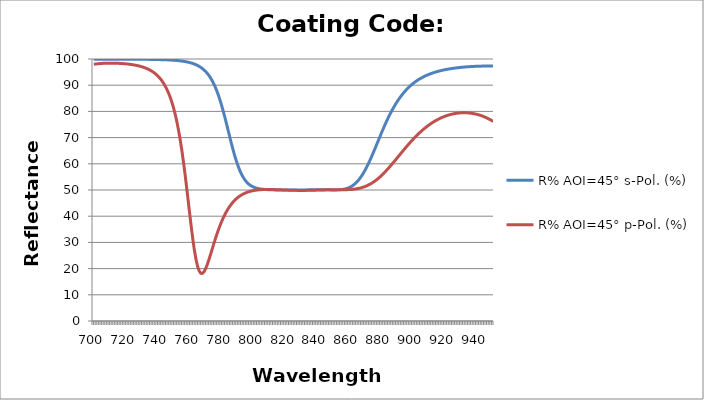
| Category | R% AOI=45° s-Pol. (%) | R% AOI=45° p-Pol. (%) |
|---|---|---|
| 700.0 | 99.902 | 97.995 |
| 701.0 | 99.907 | 98.077 |
| 702.0 | 99.912 | 98.148 |
| 703.0 | 99.915 | 98.208 |
| 704.0 | 99.918 | 98.259 |
| 705.0 | 99.921 | 98.301 |
| 706.0 | 99.923 | 98.335 |
| 707.0 | 99.925 | 98.362 |
| 708.0 | 99.926 | 98.382 |
| 709.0 | 99.927 | 98.395 |
| 710.0 | 99.928 | 98.403 |
| 711.0 | 99.929 | 98.404 |
| 712.0 | 99.929 | 98.4 |
| 713.0 | 99.929 | 98.39 |
| 714.0 | 99.929 | 98.374 |
| 715.0 | 99.928 | 98.353 |
| 716.0 | 99.927 | 98.325 |
| 717.0 | 99.926 | 98.292 |
| 718.0 | 99.925 | 98.252 |
| 719.0 | 99.924 | 98.205 |
| 720.0 | 99.922 | 98.151 |
| 721.0 | 99.92 | 98.09 |
| 722.0 | 99.918 | 98.02 |
| 723.0 | 99.915 | 97.942 |
| 724.0 | 99.913 | 97.853 |
| 725.0 | 99.909 | 97.754 |
| 726.0 | 99.906 | 97.643 |
| 727.0 | 99.902 | 97.519 |
| 728.0 | 99.898 | 97.38 |
| 729.0 | 99.893 | 97.226 |
| 730.0 | 99.887 | 97.052 |
| 731.0 | 99.882 | 96.859 |
| 732.0 | 99.875 | 96.642 |
| 733.0 | 99.868 | 96.399 |
| 734.0 | 99.86 | 96.126 |
| 735.0 | 99.851 | 95.819 |
| 736.0 | 99.842 | 95.473 |
| 737.0 | 99.831 | 95.084 |
| 738.0 | 99.819 | 94.643 |
| 739.0 | 99.806 | 94.143 |
| 740.0 | 99.791 | 93.577 |
| 741.0 | 99.775 | 92.932 |
| 742.0 | 99.757 | 92.197 |
| 743.0 | 99.737 | 91.357 |
| 744.0 | 99.715 | 90.396 |
| 745.0 | 99.69 | 89.293 |
| 746.0 | 99.663 | 88.076 |
| 747.0 | 99.633 | 86.683 |
| 748.0 | 99.6 | 85.088 |
| 749.0 | 99.562 | 83.26 |
| 750.0 | 99.52 | 81.168 |
| 751.0 | 99.473 | 78.776 |
| 752.0 | 99.42 | 76.05 |
| 753.0 | 99.36 | 72.956 |
| 754.0 | 99.292 | 69.467 |
| 755.0 | 99.215 | 65.567 |
| 756.0 | 99.128 | 61.257 |
| 757.0 | 99.029 | 56.568 |
| 758.0 | 98.916 | 51.562 |
| 759.0 | 98.787 | 46.348 |
| 760.0 | 98.64 | 41.076 |
| 761.0 | 98.472 | 35.938 |
| 762.0 | 98.28 | 31.146 |
| 763.0 | 98.059 | 26.912 |
| 764.0 | 97.805 | 23.416 |
| 765.0 | 97.513 | 20.778 |
| 766.0 | 97.176 | 19.05 |
| 767.0 | 96.788 | 18.206 |
| 768.0 | 96.341 | 18.162 |
| 769.0 | 95.826 | 18.792 |
| 770.0 | 95.231 | 19.951 |
| 771.0 | 94.547 | 21.496 |
| 772.0 | 93.76 | 23.297 |
| 773.0 | 92.858 | 25.244 |
| 774.0 | 91.826 | 27.249 |
| 775.0 | 90.651 | 29.248 |
| 776.0 | 89.321 | 31.191 |
| 777.0 | 87.824 | 33.046 |
| 778.0 | 86.156 | 34.795 |
| 779.0 | 84.312 | 36.424 |
| 780.0 | 82.3 | 37.93 |
| 781.0 | 80.132 | 39.311 |
| 782.0 | 77.833 | 40.572 |
| 783.0 | 75.434 | 41.717 |
| 784.0 | 72.976 | 42.752 |
| 785.0 | 70.509 | 43.685 |
| 786.0 | 68.082 | 44.523 |
| 787.0 | 65.745 | 45.272 |
| 788.0 | 63.541 | 45.941 |
| 789.0 | 61.507 | 46.536 |
| 790.0 | 59.667 | 47.064 |
| 791.0 | 58.034 | 47.53 |
| 792.0 | 56.612 | 47.941 |
| 793.0 | 55.392 | 48.302 |
| 794.0 | 54.363 | 48.617 |
| 795.0 | 53.506 | 48.891 |
| 796.0 | 52.802 | 49.129 |
| 797.0 | 52.228 | 49.334 |
| 798.0 | 51.765 | 49.509 |
| 799.0 | 51.395 | 49.658 |
| 800.0 | 51.1 | 49.783 |
| 801.0 | 50.867 | 49.888 |
| 802.0 | 50.683 | 49.973 |
| 803.0 | 50.539 | 50.042 |
| 804.0 | 50.425 | 50.097 |
| 805.0 | 50.335 | 50.138 |
| 806.0 | 50.265 | 50.168 |
| 807.0 | 50.209 | 50.188 |
| 808.0 | 50.165 | 50.199 |
| 809.0 | 50.129 | 50.202 |
| 810.0 | 50.101 | 50.198 |
| 811.0 | 50.077 | 50.189 |
| 812.0 | 50.058 | 50.176 |
| 813.0 | 50.043 | 50.158 |
| 814.0 | 50.03 | 50.137 |
| 815.0 | 50.02 | 50.114 |
| 816.0 | 50.011 | 50.089 |
| 817.0 | 50.004 | 50.063 |
| 818.0 | 49.998 | 50.036 |
| 819.0 | 49.993 | 50.01 |
| 820.0 | 49.989 | 49.984 |
| 821.0 | 49.986 | 49.96 |
| 822.0 | 49.985 | 49.937 |
| 823.0 | 49.984 | 49.916 |
| 824.0 | 49.985 | 49.897 |
| 825.0 | 49.986 | 49.881 |
| 826.0 | 49.989 | 49.868 |
| 827.0 | 49.993 | 49.858 |
| 828.0 | 49.998 | 49.85 |
| 829.0 | 50.004 | 49.847 |
| 830.0 | 50.011 | 49.846 |
| 831.0 | 50.019 | 49.848 |
| 832.0 | 50.028 | 49.854 |
| 833.0 | 50.038 | 49.862 |
| 834.0 | 50.047 | 49.873 |
| 835.0 | 50.057 | 49.886 |
| 836.0 | 50.066 | 49.9 |
| 837.0 | 50.075 | 49.916 |
| 838.0 | 50.082 | 49.933 |
| 839.0 | 50.088 | 49.951 |
| 840.0 | 50.092 | 49.969 |
| 841.0 | 50.094 | 49.986 |
| 842.0 | 50.093 | 50.003 |
| 843.0 | 50.09 | 50.019 |
| 844.0 | 50.084 | 50.034 |
| 845.0 | 50.076 | 50.047 |
| 846.0 | 50.066 | 50.058 |
| 847.0 | 50.056 | 50.067 |
| 848.0 | 50.045 | 50.074 |
| 849.0 | 50.036 | 50.079 |
| 850.0 | 50.03 | 50.083 |
| 851.0 | 50.03 | 50.085 |
| 852.0 | 50.039 | 50.086 |
| 853.0 | 50.06 | 50.088 |
| 854.0 | 50.098 | 50.089 |
| 855.0 | 50.157 | 50.092 |
| 856.0 | 50.242 | 50.097 |
| 857.0 | 50.359 | 50.106 |
| 858.0 | 50.515 | 50.121 |
| 859.0 | 50.717 | 50.142 |
| 860.0 | 50.972 | 50.172 |
| 861.0 | 51.287 | 50.212 |
| 862.0 | 51.669 | 50.264 |
| 863.0 | 52.126 | 50.331 |
| 864.0 | 52.664 | 50.414 |
| 865.0 | 53.288 | 50.516 |
| 866.0 | 54.003 | 50.639 |
| 867.0 | 54.811 | 50.785 |
| 868.0 | 55.714 | 50.956 |
| 869.0 | 56.709 | 51.154 |
| 870.0 | 57.795 | 51.381 |
| 871.0 | 58.966 | 51.64 |
| 872.0 | 60.215 | 51.93 |
| 873.0 | 61.532 | 52.254 |
| 874.0 | 62.907 | 52.612 |
| 875.0 | 64.329 | 53.006 |
| 876.0 | 65.784 | 53.434 |
| 877.0 | 67.26 | 53.897 |
| 878.0 | 68.744 | 54.395 |
| 879.0 | 70.224 | 54.926 |
| 880.0 | 71.688 | 55.49 |
| 881.0 | 73.127 | 56.084 |
| 882.0 | 74.532 | 56.706 |
| 883.0 | 75.895 | 57.354 |
| 884.0 | 77.191 | 58.019 |
| 885.0 | 78.437 | 58.704 |
| 886.0 | 79.629 | 59.407 |
| 887.0 | 80.765 | 60.123 |
| 888.0 | 81.844 | 60.851 |
| 889.0 | 82.865 | 61.587 |
| 890.0 | 83.829 | 62.328 |
| 891.0 | 84.737 | 63.072 |
| 892.0 | 85.591 | 63.815 |
| 893.0 | 86.392 | 64.555 |
| 894.0 | 87.142 | 65.29 |
| 895.0 | 87.845 | 66.016 |
| 896.0 | 88.502 | 66.731 |
| 897.0 | 89.116 | 67.435 |
| 898.0 | 89.688 | 68.124 |
| 899.0 | 90.223 | 68.798 |
| 900.0 | 90.722 | 69.455 |
| 901.0 | 91.187 | 70.094 |
| 902.0 | 91.62 | 70.714 |
| 903.0 | 92.025 | 71.313 |
| 904.0 | 92.402 | 71.892 |
| 905.0 | 92.753 | 72.449 |
| 906.0 | 93.081 | 72.985 |
| 907.0 | 93.387 | 73.499 |
| 908.0 | 93.672 | 73.99 |
| 909.0 | 93.939 | 74.46 |
| 910.0 | 94.187 | 74.907 |
| 911.0 | 94.42 | 75.332 |
| 912.0 | 94.636 | 75.734 |
| 913.0 | 94.839 | 76.115 |
| 914.0 | 95.028 | 76.474 |
| 915.0 | 95.205 | 76.812 |
| 916.0 | 95.371 | 77.128 |
| 917.0 | 95.525 | 77.424 |
| 918.0 | 95.67 | 77.698 |
| 919.0 | 95.805 | 77.952 |
| 920.0 | 95.932 | 78.186 |
| 921.0 | 96.05 | 78.4 |
| 922.0 | 96.16 | 78.594 |
| 923.0 | 96.264 | 78.769 |
| 924.0 | 96.36 | 78.924 |
| 925.0 | 96.45 | 79.06 |
| 926.0 | 96.534 | 79.178 |
| 927.0 | 96.613 | 79.276 |
| 928.0 | 96.686 | 79.356 |
| 929.0 | 96.754 | 79.417 |
| 930.0 | 96.817 | 79.459 |
| 931.0 | 96.875 | 79.483 |
| 932.0 | 96.93 | 79.489 |
| 933.0 | 96.98 | 79.475 |
| 934.0 | 97.026 | 79.443 |
| 935.0 | 97.068 | 79.392 |
| 936.0 | 97.107 | 79.322 |
| 937.0 | 97.142 | 79.233 |
| 938.0 | 97.174 | 79.124 |
| 939.0 | 97.202 | 78.995 |
| 940.0 | 97.228 | 78.846 |
| 941.0 | 97.25 | 78.677 |
| 942.0 | 97.269 | 78.487 |
| 943.0 | 97.286 | 78.276 |
| 944.0 | 97.299 | 78.043 |
| 945.0 | 97.31 | 77.788 |
| 946.0 | 97.318 | 77.51 |
| 947.0 | 97.323 | 77.208 |
| 948.0 | 97.325 | 76.883 |
| 949.0 | 97.325 | 76.533 |
| 950.0 | 97.322 | 76.158 |